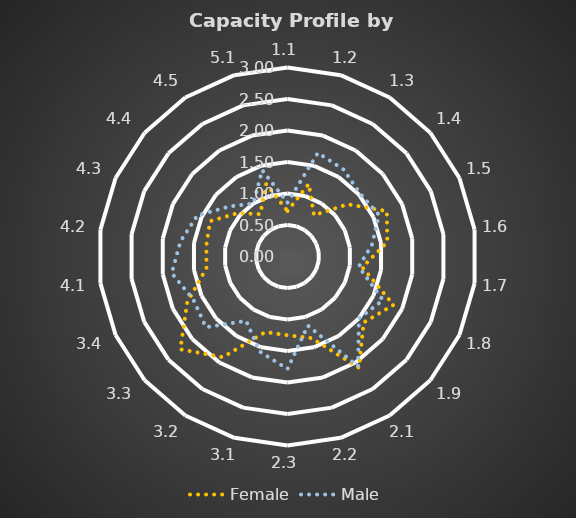
| Category | Female | Male |
|---|---|---|
| 1.1 | 0.722 | 0.857 |
| 1.2 | 1.2 | 1.714 |
| 1.3 | 0.778 | 1.643 |
| 1.4 | 1.267 | 1.524 |
| 1.5 | 1.733 | 1.595 |
| 1.6 | 1.6 | 1.357 |
| 1.7 | 1.2 | 1.143 |
| 1.8 | 1.85 | 1.667 |
| 1.9 | 1.6 | 1.5 |
| 2.1 | 2.1 | 2.071 |
| 2.2 | 1.35 | 1.143 |
| 2.3 | 1.25 | 1.786 |
| 3.1 | 1.25 | 1.571 |
| 3.2 | 1.9 | 1.214 |
| 3.3 | 2.25 | 1.714 |
| 3.4 | 1.75 | 1.643 |
| 4.1 | 1.3 | 1.857 |
| 4.2 | 1.3 | 1.714 |
| 4.3 | 1.35 | 1.571 |
| 4.4 | 1.05 | 1.214 |
| 4.5 | 0.8 | 1 |
| 5.1 | 1.2 | 1.429 |